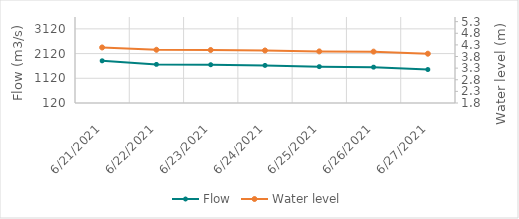
| Category | Flow |
|---|---|
| 5/25/21 | 2351.09 |
| 5/24/21 | 2551.13 |
| 5/23/21 | 2833.42 |
| 5/22/21 | 3129.19 |
| 5/21/21 | 3396.63 |
| 5/20/21 | 3535.09 |
| 5/19/21 | 3496.98 |